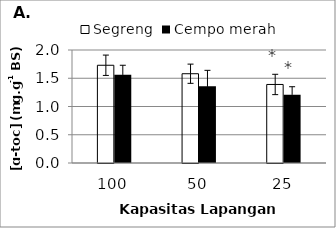
| Category | Segreng | Cempo merah |
|---|---|---|
| 0 | 1.73 | 1.56 |
| 1 | 1.58 | 1.36 |
| 2 | 1.39 | 1.21 |